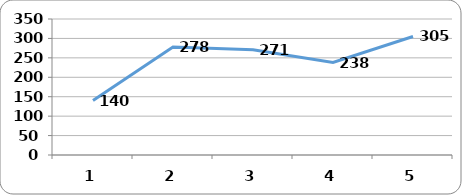
| Category | Series 0 |
|---|---|
| 0 | 140 |
| 1 | 278 |
| 2 | 271 |
| 3 | 238 |
| 4 | 305 |